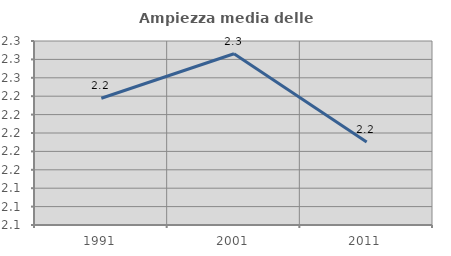
| Category | Ampiezza media delle famiglie |
|---|---|
| 1991.0 | 2.238 |
| 2001.0 | 2.286 |
| 2011.0 | 2.19 |